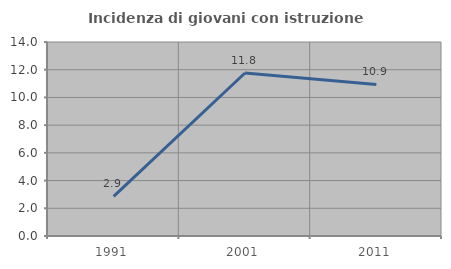
| Category | Incidenza di giovani con istruzione universitaria |
|---|---|
| 1991.0 | 2.857 |
| 2001.0 | 11.765 |
| 2011.0 | 10.938 |